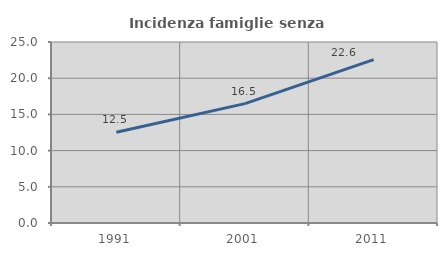
| Category | Incidenza famiglie senza nuclei |
|---|---|
| 1991.0 | 12.54 |
| 2001.0 | 16.493 |
| 2011.0 | 22.565 |